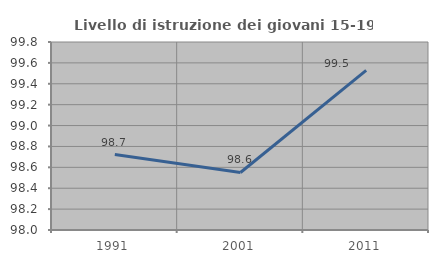
| Category | Livello di istruzione dei giovani 15-19 anni |
|---|---|
| 1991.0 | 98.722 |
| 2001.0 | 98.551 |
| 2011.0 | 99.528 |